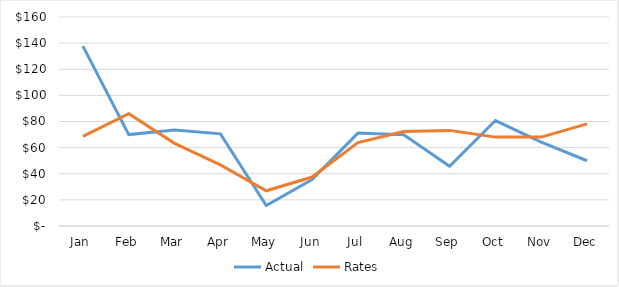
| Category | Actual | Rates |
|---|---|---|
| Jan | 137.737 | 68.601 |
| Feb | 69.973 | 85.938 |
| Mar | 73.578 | 63.256 |
| Apr | 70.532 | 46.832 |
| May | 15.686 | 26.982 |
| Jun | 35.544 | 37.495 |
| Jul | 71.131 | 63.873 |
| Aug | 69.79 | 72.367 |
| Sep | 45.709 | 73.201 |
| Oct | 80.722 | 68.04 |
| Nov | 64.186 | 68.047 |
| Dec | 49.963 | 78.22 |